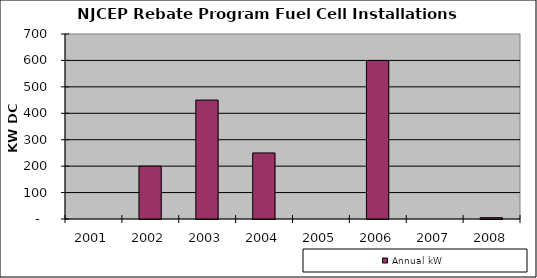
| Category | Annual kW |
|---|---|
| 2001.0 | 0 |
| 2002.0 | 200 |
| 2003.0 | 450 |
| 2004.0 | 250 |
| 2005.0 | 0 |
| 2006.0 | 600 |
| 2007.0 | 0 |
| 2008.0 | 5 |